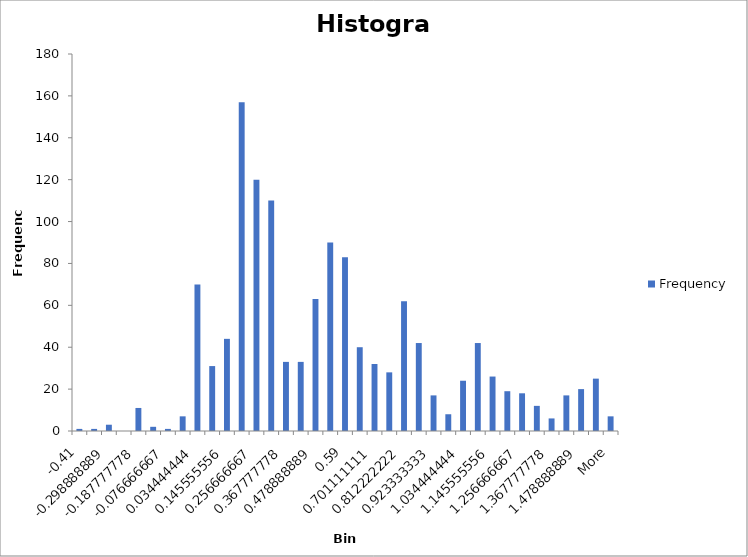
| Category | Frequency |
|---|---|
| -0.41 | 1 |
| -0.354444444 | 1 |
| -0.298888889 | 3 |
| -0.243333333 | 0 |
| -0.187777778 | 11 |
| -0.132222222 | 2 |
| -0.076666667 | 1 |
| -0.021111111 | 7 |
| 0.034444444 | 70 |
| 0.09 | 31 |
| 0.145555556 | 44 |
| 0.201111111 | 157 |
| 0.256666667 | 120 |
| 0.312222222 | 110 |
| 0.367777778 | 33 |
| 0.423333333 | 33 |
| 0.478888889 | 63 |
| 0.534444444 | 90 |
| 0.59 | 83 |
| 0.645555556 | 40 |
| 0.701111111 | 32 |
| 0.756666667 | 28 |
| 0.812222222 | 62 |
| 0.867777778 | 42 |
| 0.923333333 | 17 |
| 0.978888889 | 8 |
| 1.034444444 | 24 |
| 1.09 | 42 |
| 1.145555556 | 26 |
| 1.201111111 | 19 |
| 1.256666667 | 18 |
| 1.312222222 | 12 |
| 1.367777778 | 6 |
| 1.423333333 | 17 |
| 1.478888889 | 20 |
| 1.534444444 | 25 |
| More | 7 |